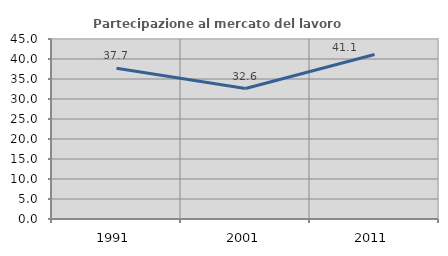
| Category | Partecipazione al mercato del lavoro  femminile |
|---|---|
| 1991.0 | 37.681 |
| 2001.0 | 32.62 |
| 2011.0 | 41.127 |